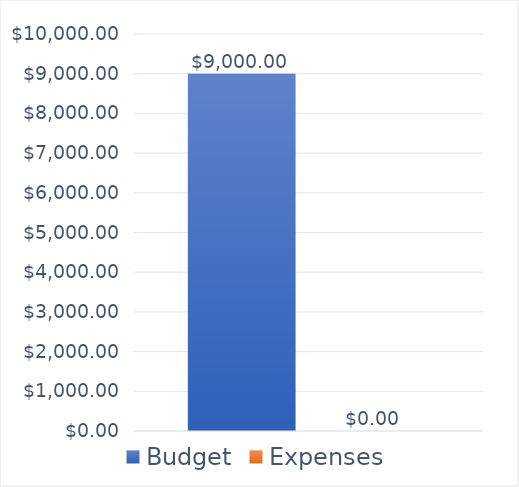
| Category | Budget | Expenses |
|---|---|---|
| 0 | 9000 | 0 |